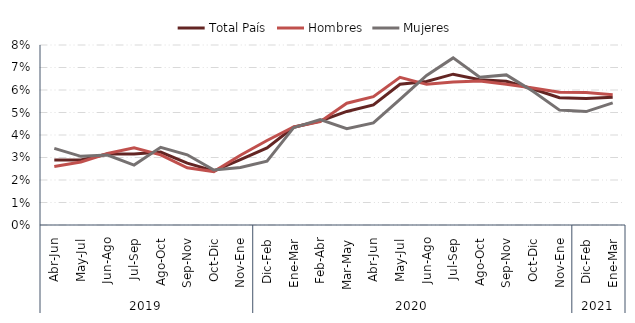
| Category | Total País | Hombres | Mujeres |
|---|---|---|---|
| 0 | 0.029 | 0.026 | 0.034 |
| 1 | 0.029 | 0.028 | 0.031 |
| 2 | 0.032 | 0.032 | 0.031 |
| 3 | 0.032 | 0.034 | 0.027 |
| 4 | 0.032 | 0.031 | 0.035 |
| 5 | 0.027 | 0.025 | 0.031 |
| 6 | 0.024 | 0.024 | 0.024 |
| 7 | 0.029 | 0.031 | 0.026 |
| 8 | 0.034 | 0.038 | 0.028 |
| 9 | 0.043 | 0.044 | 0.043 |
| 10 | 0.046 | 0.046 | 0.047 |
| 11 | 0.05 | 0.054 | 0.043 |
| 12 | 0.053 | 0.057 | 0.045 |
| 13 | 0.063 | 0.066 | 0.056 |
| 14 | 0.064 | 0.063 | 0.066 |
| 15 | 0.067 | 0.064 | 0.074 |
| 16 | 0.065 | 0.064 | 0.066 |
| 17 | 0.064 | 0.063 | 0.067 |
| 18 | 0.06 | 0.061 | 0.059 |
| 19 | 0.057 | 0.059 | 0.051 |
| 20 | 0.056 | 0.059 | 0.05 |
| 21 | 0.057 | 0.058 | 0.054 |